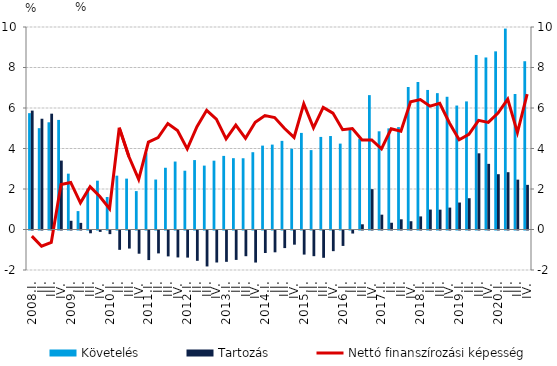
| Category | Követelés | Tartozás |
|---|---|---|
| 2008.I. | 5.745 | 5.872 |
| II. | 5.004 | 5.47 |
| III. | 5.295 | 5.72 |
| IV. | 5.412 | 3.403 |
| 2009.I. | 2.758 | 0.431 |
| II. | 0.909 | 0.328 |
| III. | 2.023 | -0.137 |
| IV. | 2.411 | -0.068 |
| 2010.I. | 1.606 | -0.179 |
| II. | 2.659 | -0.955 |
| III. | 2.512 | -0.892 |
| IV. | 1.896 | -1.146 |
| 2011.I. | 3.789 | -1.461 |
| II. | 2.467 | -1.131 |
| III. | 3.049 | -1.278 |
| IV. | 3.356 | -1.33 |
| 2012.I. | 2.903 | -1.338 |
| II. | 3.428 | -1.497 |
| III. | 3.155 | -1.775 |
| IV. | 3.399 | -1.58 |
| 2013.I. | 3.635 | -1.547 |
| II. | 3.523 | -1.452 |
| III. | 3.518 | -1.269 |
| IV. | 3.817 | -1.582 |
| 2014.I. | 4.142 | -1.111 |
| II. | 4.192 | -1.077 |
| III. | 4.377 | -0.869 |
| IV. | 3.989 | -0.7 |
| 2015.I. | 4.77 | -1.189 |
| II. | 3.921 | -1.268 |
| III. | 4.572 | -1.348 |
| IV. | 4.616 | -1.02 |
| 2016.I. | 4.242 | -0.761 |
| II. | 4.914 | -0.15 |
| III. | 4.489 | 0.257 |
| IV. | 6.636 | 1.993 |
| 2017.I. | 4.849 | 0.732 |
| II. | 4.994 | 0.333 |
| III. | 5.057 | 0.504 |
| IV. | 7.036 | 0.408 |
| 2018.I. | 7.284 | 0.647 |
| II. | 6.891 | 0.985 |
| III. | 6.734 | 0.98 |
| IV. | 6.555 | 1.082 |
| 2019.I. | 6.121 | 1.332 |
| II. | 6.326 | 1.545 |
| III. | 8.62 | 3.762 |
| IV. | 8.495 | 3.241 |
| 2020.I. | 8.797 | 2.731 |
| II. | 9.922 | 2.83 |
| III. | 6.69 | 2.462 |
| IV. | 8.309 | 2.205 |